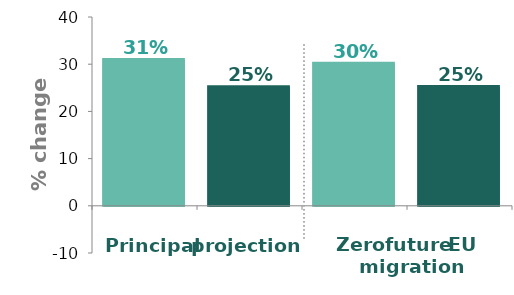
| Category | Series 0 |
|---|---|
| UK principal projection | 30.873 |
| Scotland principal projection | 25.11 |
| UK Zero future EU migration variant | 30.119 |
| Scotland Zero future EU migration variant | 25.146 |